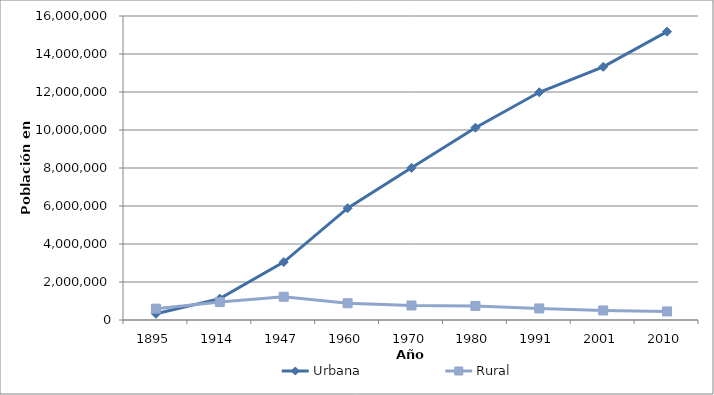
| Category | Urbana | Rural |
|---|---|---|
| 1895.0 | 324539 | 596629 |
| 1914.0 | 1124049 | 942899 |
| 1947.0 | 3049182 | 1223155 |
| 1960.0 | 5883995 | 882113 |
| 1970.0 | 8011145 | 763384 |
| 1980.0 | 10122513 | 742895 |
| 1991.0 | 11986709 | 608265 |
| 2001.0 | 13324241 | 502962 |
| 2010.0 | 15174946 | 450138 |